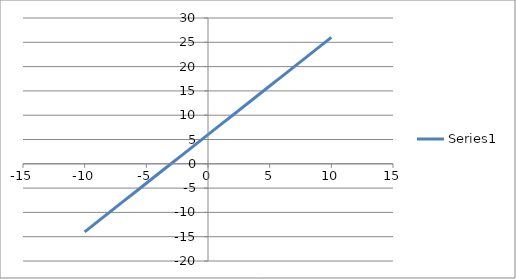
| Category | Series 0 |
|---|---|
| -10.0 | -14 |
| -9.0 | -12 |
| -8.0 | -10 |
| -7.0 | -8 |
| -6.0 | -6 |
| -5.0 | -4 |
| -4.0 | -2 |
| -3.0 | 0 |
| -2.0 | 2 |
| -1.0 | 4 |
| 0.0 | 6 |
| 1.0 | 8 |
| 2.0 | 10 |
| 3.0 | 12 |
| 4.0 | 14 |
| 5.0 | 16 |
| 6.0 | 18 |
| 7.0 | 20 |
| 8.0 | 22 |
| 9.0 | 24 |
| 10.0 | 26 |